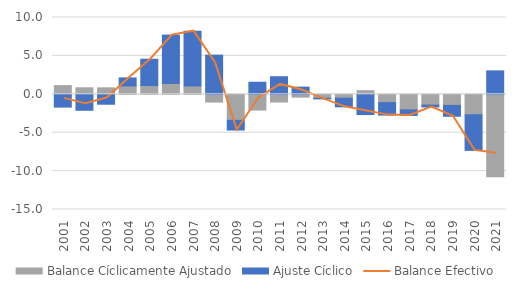
| Category | Balance Cíclicamente Ajustado | Ajuste Cíclico |
|---|---|---|
| 2001.0 | 1.136 | -1.669 |
| 2002.0 | 0.847 | -2.084 |
| 2003.0 | 0.844 | -1.295 |
| 2004.0 | 1.086 | 1.049 |
| 2005.0 | 1.138 | 3.427 |
| 2006.0 | 1.414 | 6.293 |
| 2007.0 | 1.084 | 7.129 |
| 2008.0 | -1.012 | 5.1 |
| 2009.0 | -3.393 | -1.259 |
| 2010.0 | -2.056 | 1.571 |
| 2011.0 | -1.004 | 2.289 |
| 2012.0 | -0.371 | 0.935 |
| 2013.0 | -0.518 | -0.082 |
| 2014.0 | -0.503 | -1.131 |
| 2015.0 | 0.475 | -2.64 |
| 2016.0 | -1.083 | -1.628 |
| 2017.0 | -2.032 | -0.72 |
| 2018.0 | -1.404 | -0.249 |
| 2019.0 | -1.444 | -1.419 |
| 2020.0 | -2.666 | -4.637 |
| 2021.0 | -10.736 | 3.049 |